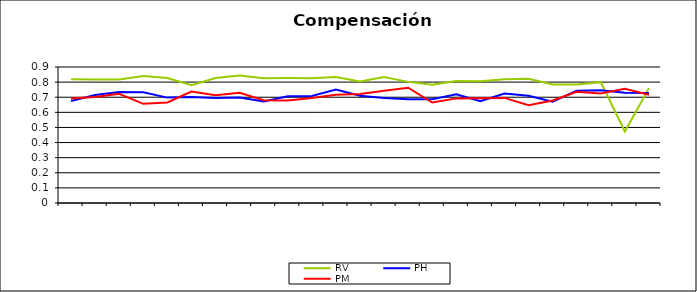
| Category | RV | PH | PM |
|---|---|---|---|
| 0 | 0.819 | 0.675 | 0.691 |
| 1 | 0.818 | 0.714 | 0.701 |
| 2 | 0.817 | 0.734 | 0.722 |
| 3 | 0.84 | 0.732 | 0.656 |
| 4 | 0.827 | 0.697 | 0.666 |
| 5 | 0.78 | 0.701 | 0.737 |
| 6 | 0.827 | 0.695 | 0.713 |
| 7 | 0.844 | 0.699 | 0.73 |
| 8 | 0.826 | 0.672 | 0.68 |
| 9 | 0.827 | 0.706 | 0.678 |
| 10 | 0.826 | 0.709 | 0.696 |
| 11 | 0.834 | 0.751 | 0.717 |
| 12 | 0.804 | 0.709 | 0.721 |
| 13 | 0.834 | 0.694 | 0.743 |
| 14 | 0.802 | 0.687 | 0.763 |
| 15 | 0.783 | 0.687 | 0.665 |
| 16 | 0.807 | 0.72 | 0.692 |
| 17 | 0.805 | 0.674 | 0.693 |
| 18 | 0.82 | 0.724 | 0.695 |
| 19 | 0.822 | 0.71 | 0.646 |
| 20 | 0.784 | 0.67 | 0.678 |
| 21 | 0.785 | 0.743 | 0.736 |
| 22 | 0.8 | 0.745 | 0.725 |
| 23 | 0.473 | 0.729 | 0.756 |
| 24 | 0.76 | 0.727 | 0.716 |